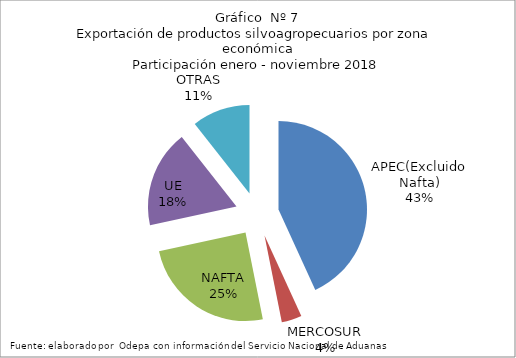
| Category | Series 0 |
|---|---|
| APEC(Excluido Nafta) | 7058130.704 |
| MERCOSUR | 603460.804 |
| NAFTA | 4046348.605 |
| UE | 2906693.089 |
| OTRAS | 1735249.797 |